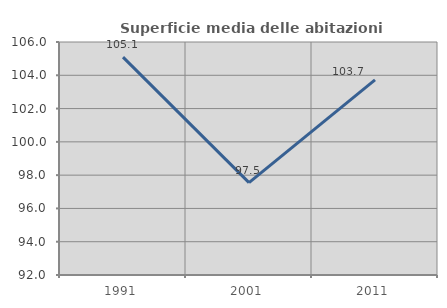
| Category | Superficie media delle abitazioni occupate |
|---|---|
| 1991.0 | 105.091 |
| 2001.0 | 97.549 |
| 2011.0 | 103.725 |